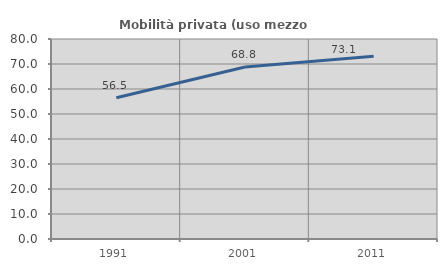
| Category | Mobilità privata (uso mezzo privato) |
|---|---|
| 1991.0 | 56.489 |
| 2001.0 | 68.78 |
| 2011.0 | 73.088 |